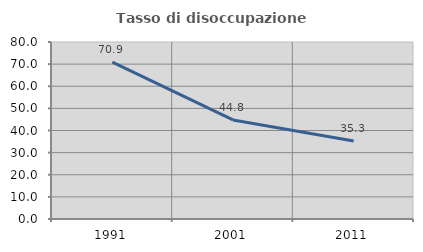
| Category | Tasso di disoccupazione giovanile  |
|---|---|
| 1991.0 | 70.94 |
| 2001.0 | 44.776 |
| 2011.0 | 35.294 |